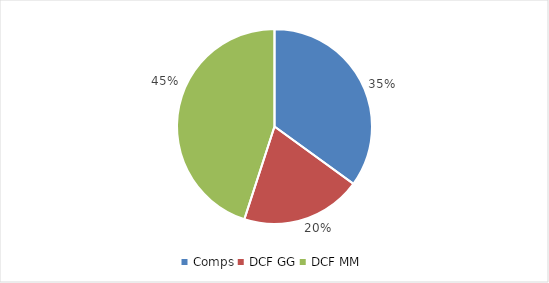
| Category | Series 0 |
|---|---|
| Comps | 0.35 |
| DCF GG | 0.2 |
| DCF MM | 0.45 |